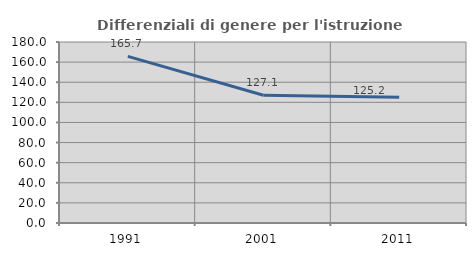
| Category | Differenziali di genere per l'istruzione superiore |
|---|---|
| 1991.0 | 165.714 |
| 2001.0 | 127.094 |
| 2011.0 | 125.15 |